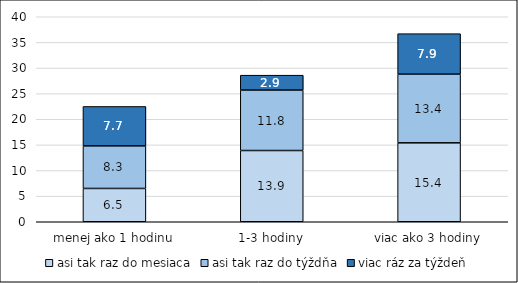
| Category | asi tak raz do mesiaca | asi tak raz do týždňa | viac ráz za týždeň |
|---|---|---|---|
| menej ako 1 hodinu | 6.5 | 8.3 | 7.7 |
| 1-3 hodiny | 13.9 | 11.8 | 2.9 |
| viac ako 3 hodiny | 15.4 | 13.4 | 7.9 |